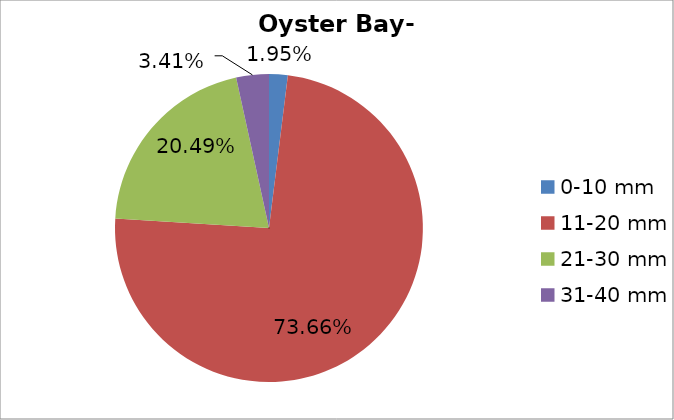
| Category | Series 0 |
|---|---|
| 0-10 mm | 0.02 |
| 11-20 mm | 0.737 |
| 21-30 mm | 0.205 |
| 31-40 mm | 0.034 |